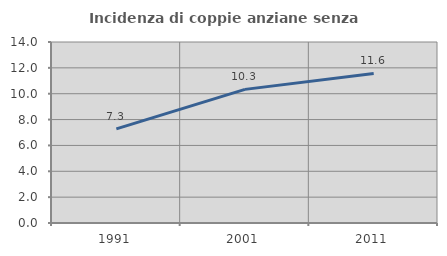
| Category | Incidenza di coppie anziane senza figli  |
|---|---|
| 1991.0 | 7.276 |
| 2001.0 | 10.335 |
| 2011.0 | 11.568 |